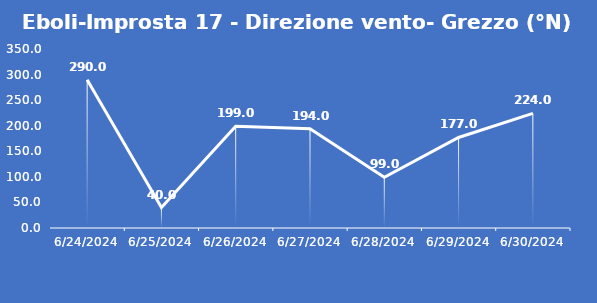
| Category | Eboli-Improsta 17 - Direzione vento- Grezzo (°N) |
|---|---|
| 6/24/24 | 290 |
| 6/25/24 | 40 |
| 6/26/24 | 199 |
| 6/27/24 | 194 |
| 6/28/24 | 99 |
| 6/29/24 | 177 |
| 6/30/24 | 224 |